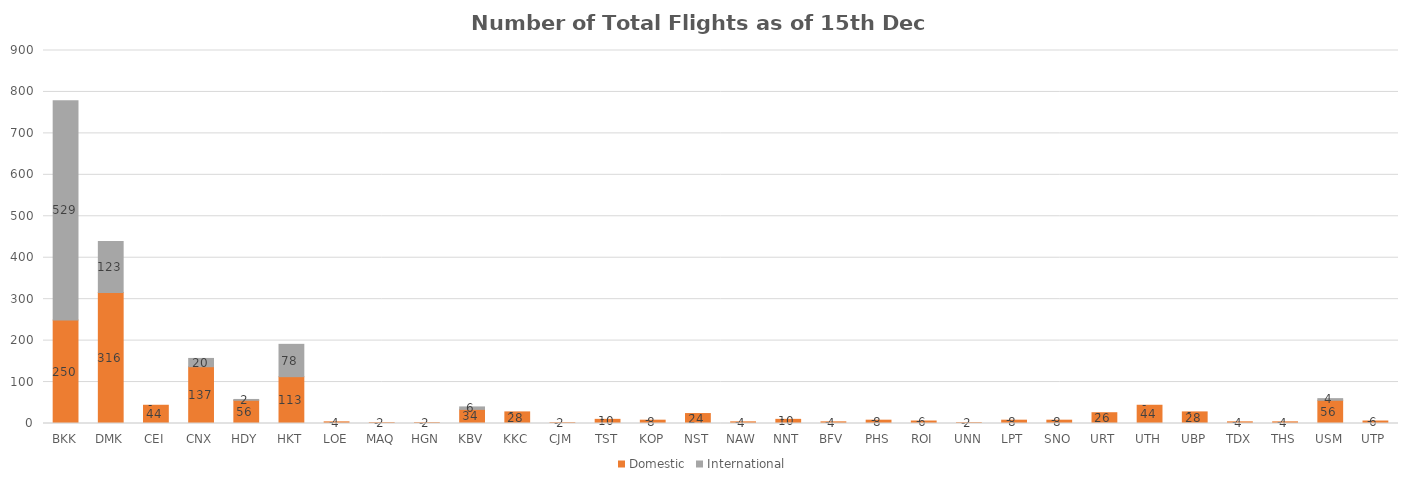
| Category | Domestic | International |
|---|---|---|
| BKK | 250 | 529 |
| DMK | 316 | 123 |
| CEI | 44 | 0 |
| CNX | 137 | 20 |
| HDY | 56 | 2 |
| HKT | 113 | 78 |
| LOE | 4 | 0 |
| MAQ | 2 | 0 |
| HGN | 2 | 0 |
| KBV | 34 | 6 |
| KKC | 28 | 0 |
| CJM | 2 | 0 |
| TST | 10 | 0 |
| KOP | 8 | 0 |
| NST | 24 | 0 |
| NAW | 4 | 0 |
| NNT | 10 | 0 |
| BFV | 4 | 0 |
| PHS | 8 | 0 |
| ROI | 6 | 0 |
| UNN | 2 | 0 |
| LPT | 8 | 0 |
| SNO | 8 | 0 |
| URT | 26 | 0 |
| UTH | 44 | 0 |
| UBP | 28 | 0 |
| TDX | 4 | 0 |
| THS | 4 | 0 |
| USM | 56 | 4 |
| UTP | 6 | 0 |